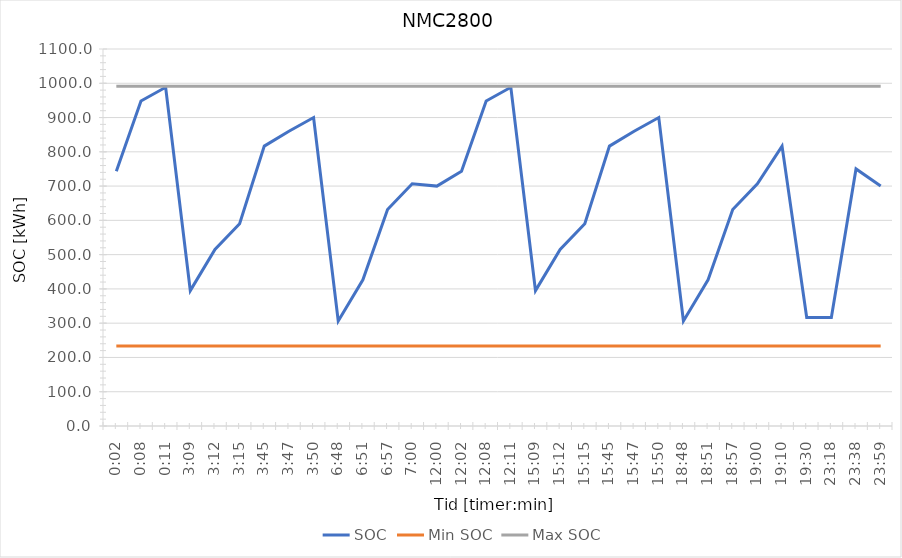
| Category | SOC | Min SOC | Max SOC |
|---|---|---|---|
| 0.001388888888888889 | 743.333 | 233.333 | 991.667 |
| 0.005555555555555556 | 948.333 | 233.333 | 991.667 |
| 0.007638888888888889 | 988.333 | 233.333 | 991.667 |
| 0.13125 | 395 | 233.333 | 991.667 |
| 0.13333333333333333 | 515 | 233.333 | 991.667 |
| 0.13541666666666666 | 590 | 233.333 | 991.667 |
| 0.15625 | 816.667 | 233.333 | 991.667 |
| 0.15763888888888888 | 860 | 233.333 | 991.667 |
| 0.15972222222222224 | 900 | 233.333 | 991.667 |
| 0.2833333333333333 | 306.667 | 233.333 | 991.667 |
| 0.28541666666666665 | 426.667 | 233.333 | 991.667 |
| 0.28958333333333336 | 631.667 | 233.333 | 991.667 |
| 0.2916666666666667 | 706.667 | 233.333 | 991.667 |
| 0.5 | 700 | 233.333 | 991.667 |
| 0.5013888888888889 | 743.333 | 233.333 | 991.667 |
| 0.5055555555555555 | 948.333 | 233.333 | 991.667 |
| 0.5076388888888889 | 988.333 | 233.333 | 991.667 |
| 0.63125 | 395 | 233.333 | 991.667 |
| 0.6333333333333333 | 515 | 233.333 | 991.667 |
| 0.6354166666666666 | 590 | 233.333 | 991.667 |
| 0.65625 | 816.667 | 233.333 | 991.667 |
| 0.6576388888888889 | 860 | 233.333 | 991.667 |
| 0.6597222222222222 | 900 | 233.333 | 991.667 |
| 0.7833333333333333 | 306.667 | 233.333 | 991.667 |
| 0.7854166666666668 | 426.667 | 233.333 | 991.667 |
| 0.7895833333333333 | 631.667 | 233.333 | 991.667 |
| 0.7916666666666666 | 706.667 | 233.333 | 991.667 |
| 0.7986111111111112 | 816.667 | 233.333 | 991.667 |
| 0.8125 | 316.667 | 233.333 | 991.667 |
| 0.9708333333333333 | 316.667 | 233.333 | 991.667 |
| 0.9847222222222222 | 750 | 233.333 | 991.667 |
| 0.9993055555555556 | 700 | 233.333 | 991.667 |